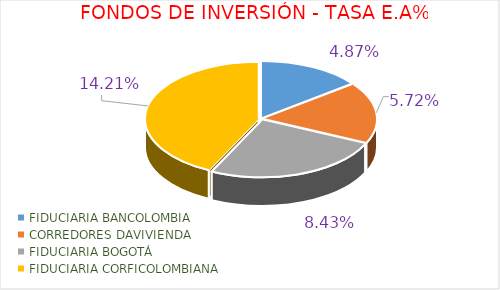
| Category | Series 0 |
|---|---|
| FIDUCIARIA BANCOLOMBIA                   | 4.87 |
| CORREDORES DAVIVIENDA                         | 5.72 |
| FIDUCIARIA BOGOTÁ                | 8.43 |
| FIDUCIARIA CORFICOLOMBIANA               | 14.21 |